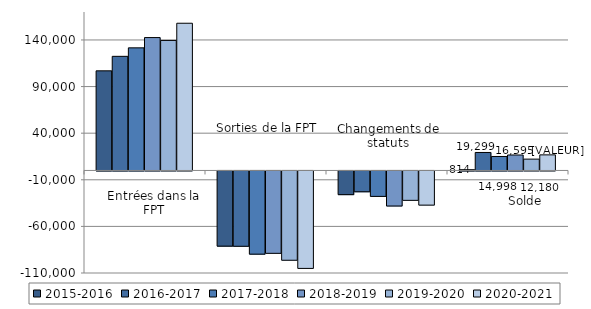
| Category | 2015-2016 | 2016-2017 | 2017-2018 | 2018-2019 | 2019-2020 | 2020-2021 |
|---|---|---|---|---|---|---|
| Entrées | 106875 | 122431 | 131541 | 142570 | 139488 | 157934 |
| Sorties | -80653 | -80800 | -89253 | -88369 | -95789 | -104546 |
| Changement de statut | -25408 | -22332 | -27290 | -37606 | -31519 | -36649 |
| Solde | 814 | 19299 | 14998 | 16595 | 12180 | 16739 |